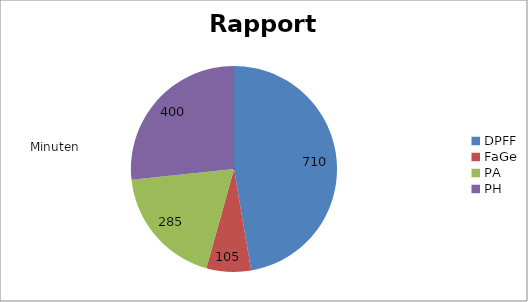
| Category | Rapporte |
|---|---|
| DPFF | 710 |
| FaGe | 105 |
| PA | 285 |
| PH | 400 |